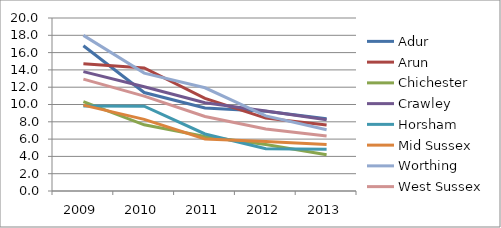
| Category | Adur | Arun | Chichester | Crawley | Horsham | Mid Sussex | Worthing | West Sussex |
|---|---|---|---|---|---|---|---|---|
| 2009.0 | 16.793 | 14.712 | 10.325 | 13.797 | 9.83 | 9.93 | 17.991 | 12.933 |
| 2010.0 | 11.38 | 14.225 | 7.649 | 12.05 | 9.807 | 8.282 | 13.629 | 10.969 |
| 2011.0 | 9.587 | 10.7 | 6.299 | 10.201 | 6.591 | 6.013 | 11.934 | 8.609 |
| 2012.0 | 9.228 | 8.424 | 5.377 | 9.257 | 4.888 | 5.735 | 8.686 | 7.159 |
| 2013.0 | 8.348 | 7.643 | 4.193 | 8.248 | 4.82 | 5.378 | 7.076 | 6.365 |